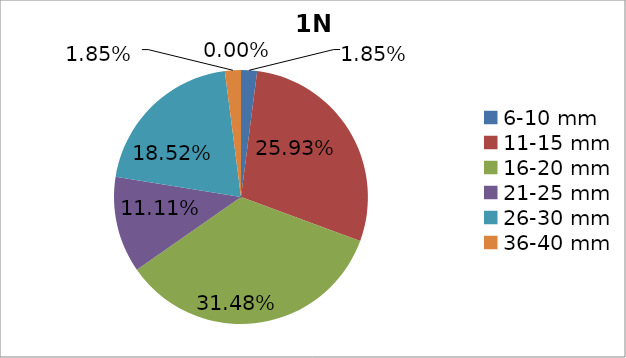
| Category | Series 0 |
|---|---|
| 6-10 mm | 0.018 |
| 11-15 mm | 0.259 |
| 16-20 mm | 0.315 |
| 21-25 mm | 0.111 |
| 26-30 mm | 0.185 |
| 36-40 mm | 0.018 |